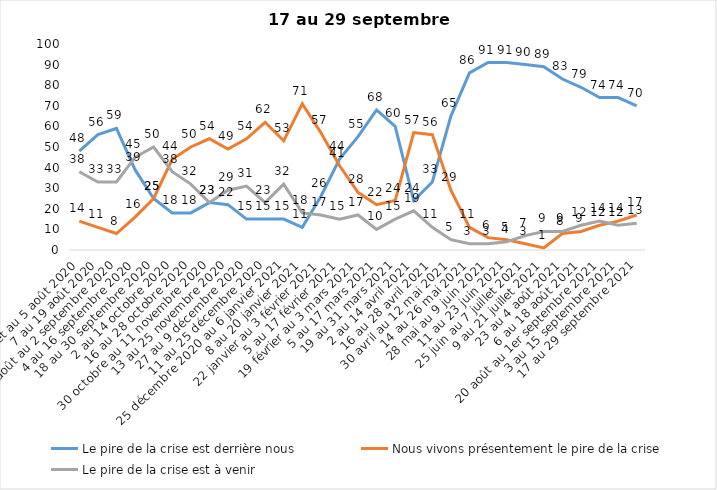
| Category | Le pire de la crise est derrière nous | Nous vivons présentement le pire de la crise | Le pire de la crise est à venir |
|---|---|---|---|
| 24 juillet au 5 août 2020 | 48 | 14 | 38 |
| 7 au 19 août 2020 | 56 | 11 | 33 |
| 21 août au 2 septembre 2020 | 59 | 8 | 33 |
| 4 au 16 septembre 2020 | 39 | 16 | 45 |
| 18 au 30 septembre 2020 | 25 | 25 | 50 |
| 2 au 14 octobre 2020 | 18 | 44 | 38 |
| 16 au 28 octobre 2020 | 18 | 50 | 32 |
| 30 octobre au 11 novembre 2020 | 23 | 54 | 23 |
| 13 au 25 novembre 2020 | 22 | 49 | 29 |
| 27 au 9 décembre 2020 | 15 | 54 | 31 |
| 11 au 25 décembre 2020 | 15 | 62 | 23 |
| 25 décembre 2020 au 6 janvier 2021 | 15 | 53 | 32 |
| 8 au 20 janvier 2021 | 11 | 71 | 18 |
| 22 janvier au 3 février 2021 | 26 | 57 | 17 |
| 5 au 17 février 2021 | 44 | 41 | 15 |
| 19 février au 3 mars 2021 | 55 | 28 | 17 |
| 5 au 17 mars 2021 | 68 | 22 | 10 |
| 19 au 31 mars 2021 | 60 | 24 | 15 |
| 2 au 14 avril 2021 | 24 | 57 | 19 |
| 16 au 28 avril 2021 | 33 | 56 | 11 |
| 30 avril au 12 mai 2021 | 65 | 29 | 5 |
| 14 au 26 mai 2021 | 86 | 11 | 3 |
| 28 mai au 9 juin 2021 | 91 | 6 | 3 |
| 11 au 23 juin 2021 | 91 | 5 | 4 |
| 25 juin au 7 juillet 2021 | 90 | 3 | 7 |
| 9 au 21 juillet 2021 | 89 | 1 | 9 |
| 23 au 4 août 2021 | 83 | 8 | 9 |
| 6 au 18 août 2021 | 79 | 9 | 12 |
| 20 août au 1er septembre 2021 | 74 | 12 | 14 |
| 3 au 15 septembre 2021 | 74 | 14 | 12 |
| 17 au 29 septembre 2021 | 70 | 17 | 13 |